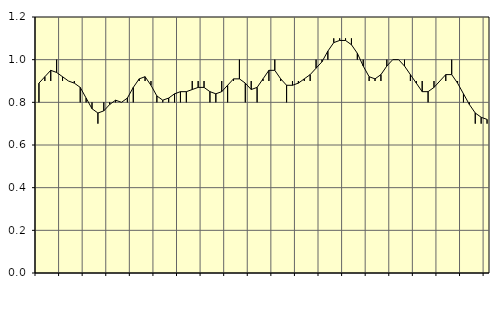
| Category | Piggar | Jordbruk, skogsbruk o fiske, SNI 01-03 |
|---|---|---|
| nan | 0.8 | 0.89 |
| 1.0 | 0.9 | 0.92 |
| 1.0 | 0.9 | 0.95 |
| 1.0 | 1 | 0.94 |
| nan | 0.9 | 0.92 |
| 2.0 | 0.9 | 0.9 |
| 2.0 | 0.9 | 0.89 |
| 2.0 | 0.8 | 0.87 |
| nan | 0.8 | 0.82 |
| 3.0 | 0.8 | 0.77 |
| 3.0 | 0.7 | 0.75 |
| 3.0 | 0.8 | 0.76 |
| nan | 0.8 | 0.79 |
| 4.0 | 0.8 | 0.81 |
| 4.0 | 0.8 | 0.8 |
| 4.0 | 0.8 | 0.82 |
| nan | 0.8 | 0.87 |
| 5.0 | 0.9 | 0.91 |
| 5.0 | 0.9 | 0.92 |
| 5.0 | 0.9 | 0.88 |
| nan | 0.8 | 0.83 |
| 6.0 | 0.8 | 0.81 |
| 6.0 | 0.8 | 0.82 |
| 6.0 | 0.8 | 0.84 |
| nan | 0.8 | 0.85 |
| 7.0 | 0.8 | 0.85 |
| 7.0 | 0.9 | 0.86 |
| 7.0 | 0.9 | 0.87 |
| nan | 0.9 | 0.87 |
| 8.0 | 0.8 | 0.85 |
| 8.0 | 0.8 | 0.84 |
| 8.0 | 0.9 | 0.85 |
| nan | 0.8 | 0.88 |
| 9.0 | 0.9 | 0.91 |
| 9.0 | 1 | 0.91 |
| 9.0 | 0.8 | 0.89 |
| nan | 0.9 | 0.86 |
| 10.0 | 0.8 | 0.87 |
| 10.0 | 0.9 | 0.91 |
| 10.0 | 0.9 | 0.95 |
| nan | 1 | 0.95 |
| 11.0 | 0.9 | 0.91 |
| 11.0 | 0.8 | 0.88 |
| 11.0 | 0.9 | 0.88 |
| nan | 0.9 | 0.89 |
| 12.0 | 0.9 | 0.91 |
| 12.0 | 0.9 | 0.93 |
| 12.0 | 1 | 0.96 |
| nan | 1 | 0.99 |
| 13.0 | 1 | 1.04 |
| 13.0 | 1.1 | 1.08 |
| 13.0 | 1.1 | 1.09 |
| nan | 1.1 | 1.09 |
| 14.0 | 1.1 | 1.07 |
| 14.0 | 1 | 1.03 |
| 14.0 | 1 | 0.97 |
| nan | 0.9 | 0.92 |
| 15.0 | 0.9 | 0.91 |
| 15.0 | 0.9 | 0.93 |
| 15.0 | 1 | 0.97 |
| nan | 1 | 1 |
| 16.0 | 1 | 1 |
| 16.0 | 1 | 0.97 |
| 16.0 | 0.9 | 0.93 |
| nan | 0.9 | 0.89 |
| 17.0 | 0.9 | 0.85 |
| 17.0 | 0.8 | 0.85 |
| 17.0 | 0.9 | 0.87 |
| nan | 0.9 | 0.9 |
| 18.0 | 0.9 | 0.93 |
| 18.0 | 1 | 0.93 |
| 18.0 | 0.9 | 0.89 |
| nan | 0.8 | 0.84 |
| 19.0 | 0.8 | 0.79 |
| 19.0 | 0.7 | 0.75 |
| 19.0 | 0.7 | 0.73 |
| nan | 0.7 | 0.72 |